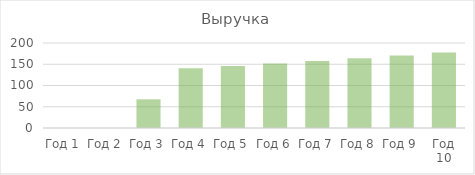
| Category | Выручка |
|---|---|
| Год 1 | 0 |
| Год 2 | 0 |
| Год 3 | 67.492 |
| Год 4 | 140.383 |
| Год 5 | 145.998 |
| Год 6 | 151.838 |
| Год 7 | 157.912 |
| Год 8 | 164.228 |
| Год 9 | 170.797 |
| Год 10 | 177.629 |